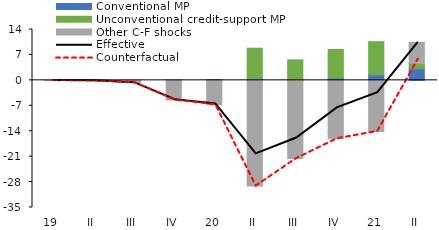
| Category | Conventional MP | Unconventional credit-support MP | Other C-F shocks |
|---|---|---|---|
| 0 | 0 | 0 | -0.056 |
| 1 | 0 | 0 | -0.117 |
| 2 | 0 | 0 | -0.644 |
| 3 | 0.082 | 0 | -5.405 |
| 4 | 0.216 | 0 | -6.721 |
| 5 | 0.07 | 8.781 | -29.085 |
| 6 | 0.16 | 5.471 | -21.513 |
| 7 | 0.62 | 7.872 | -16.078 |
| 8 | 1.523 | 9.132 | -14.057 |
| 9 | 3.189 | 1.471 | 5.802 |